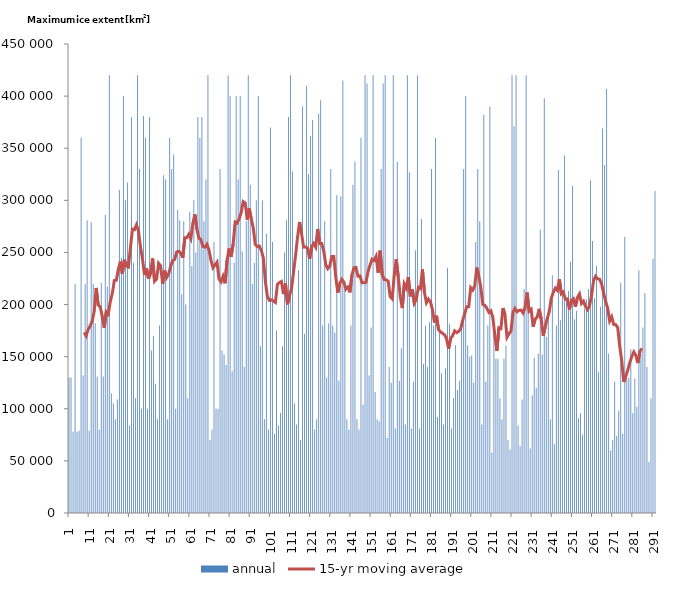
| Category | annual |
|---|---|
| 0 | 130000 |
| 1 | 130000 |
| 2 | 78000 |
| 3 | 220000 |
| 4 | 78000 |
| 5 | 79000 |
| 6 | 360000 |
| 7 | 132000 |
| 8 | 220000 |
| 9 | 281000 |
| 10 | 79000 |
| 11 | 279000 |
| 12 | 220000 |
| 13 | 182000 |
| 14 | 131000 |
| 15 | 80000 |
| 16 | 221000 |
| 17 | 131000 |
| 18 | 286000 |
| 19 | 217000 |
| 20 | 420000 |
| 21 | 115000 |
| 22 | 105000 |
| 23 | 90000 |
| 24 | 109000 |
| 25 | 310000 |
| 26 | 245000 |
| 27 | 400000 |
| 28 | 300000 |
| 29 | 317000 |
| 30 | 84000 |
| 31 | 380000 |
| 32 | 240000 |
| 33 | 110000 |
| 34 | 420000 |
| 35 | 330000 |
| 36 | 100000 |
| 37 | 381000 |
| 38 | 360000 |
| 39 | 100000 |
| 40 | 380000 |
| 41 | 156000 |
| 42 | 170000 |
| 43 | 124000 |
| 44 | 90000 |
| 45 | 180000 |
| 46 | 230000 |
| 47 | 324000 |
| 48 | 320000 |
| 49 | 90000 |
| 50 | 360000 |
| 51 | 330000 |
| 52 | 344000 |
| 53 | 100000 |
| 54 | 291000 |
| 55 | 281000 |
| 56 | 210000 |
| 57 | 280000 |
| 58 | 200000 |
| 59 | 110000 |
| 60 | 289000 |
| 61 | 237000 |
| 62 | 300000 |
| 63 | 250000 |
| 64 | 380000 |
| 65 | 360000 |
| 66 | 380000 |
| 67 | 280000 |
| 68 | 320000 |
| 69 | 420000 |
| 70 | 70000 |
| 71 | 80000 |
| 72 | 260000 |
| 73 | 100000 |
| 74 | 100000 |
| 75 | 330000 |
| 76 | 156000 |
| 77 | 152000 |
| 78 | 142000 |
| 79 | 420000 |
| 80 | 400000 |
| 81 | 136000 |
| 82 | 240000 |
| 83 | 400000 |
| 84 | 320000 |
| 85 | 400000 |
| 86 | 251000 |
| 87 | 140000 |
| 88 | 280000 |
| 89 | 420000 |
| 90 | 315000 |
| 91 | 220000 |
| 92 | 240000 |
| 93 | 300000 |
| 94 | 400000 |
| 95 | 160000 |
| 96 | 300000 |
| 97 | 90000 |
| 98 | 268000 |
| 99 | 80000 |
| 100 | 370000 |
| 101 | 260000 |
| 102 | 76000 |
| 103 | 175000 |
| 104 | 84000 |
| 105 | 96000 |
| 106 | 160000 |
| 107 | 250000 |
| 108 | 281000 |
| 109 | 380000 |
| 110 | 420000 |
| 111 | 328000 |
| 112 | 105000 |
| 113 | 85000 |
| 114 | 233000 |
| 115 | 70000 |
| 116 | 390000 |
| 117 | 172000 |
| 118 | 410000 |
| 119 | 325000 |
| 120 | 362000 |
| 121 | 377000 |
| 122 | 80000 |
| 123 | 90000 |
| 124 | 383000 |
| 125 | 396000 |
| 126 | 180000 |
| 127 | 280000 |
| 128 | 130000 |
| 129 | 182000 |
| 130 | 330000 |
| 131 | 180000 |
| 132 | 173000 |
| 133 | 305000 |
| 134 | 127000 |
| 135 | 304000 |
| 136 | 415000 |
| 137 | 215000 |
| 138 | 90000 |
| 139 | 80000 |
| 140 | 180000 |
| 141 | 315000 |
| 142 | 337000 |
| 143 | 90000 |
| 144 | 80000 |
| 145 | 360000 |
| 146 | 104000 |
| 147 | 420000 |
| 148 | 412000 |
| 149 | 132000 |
| 150 | 178000 |
| 151 | 420000 |
| 152 | 116000 |
| 153 | 90000 |
| 154 | 88000 |
| 155 | 330000 |
| 156 | 412000 |
| 157 | 420000 |
| 158 | 72000 |
| 159 | 140000 |
| 160 | 125000 |
| 161 | 420000 |
| 162 | 81000 |
| 163 | 337000 |
| 164 | 127000 |
| 165 | 158000 |
| 166 | 198000 |
| 167 | 85000 |
| 168 | 420000 |
| 169 | 327000 |
| 170 | 81000 |
| 171 | 126000 |
| 172 | 252000 |
| 173 | 420000 |
| 174 | 81000 |
| 175 | 282000 |
| 176 | 143000 |
| 177 | 180000 |
| 178 | 140000 |
| 179 | 183000 |
| 180 | 330000 |
| 181 | 180000 |
| 182 | 360000 |
| 183 | 92000 |
| 184 | 176000 |
| 185 | 134000 |
| 186 | 85000 |
| 187 | 139000 |
| 188 | 235000 |
| 189 | 181000 |
| 190 | 81000 |
| 191 | 110000 |
| 192 | 161000 |
| 193 | 118000 |
| 194 | 127000 |
| 195 | 183000 |
| 196 | 330000 |
| 197 | 400000 |
| 198 | 161000 |
| 199 | 150000 |
| 200 | 151000 |
| 201 | 125000 |
| 202 | 260000 |
| 203 | 330000 |
| 204 | 280000 |
| 205 | 85000 |
| 206 | 382000 |
| 207 | 126000 |
| 208 | 180000 |
| 209 | 390000 |
| 210 | 58000 |
| 211 | 175000 |
| 212 | 148000 |
| 213 | 148000 |
| 214 | 110000 |
| 215 | 90000 |
| 216 | 148000 |
| 217 | 161000 |
| 218 | 70000 |
| 219 | 61000 |
| 220 | 420000 |
| 221 | 371000 |
| 222 | 420000 |
| 223 | 84000 |
| 224 | 64000 |
| 225 | 109000 |
| 226 | 215000 |
| 227 | 420000 |
| 228 | 201000 |
| 229 | 62000 |
| 230 | 113000 |
| 231 | 149000 |
| 232 | 120000 |
| 233 | 153000 |
| 234 | 272000 |
| 235 | 152000 |
| 236 | 398000 |
| 237 | 169000 |
| 238 | 196000 |
| 239 | 90000 |
| 240 | 228000 |
| 241 | 66000 |
| 242 | 180000 |
| 243 | 329000 |
| 244 | 185000 |
| 245 | 211000 |
| 246 | 343000 |
| 247 | 204000 |
| 248 | 213000 |
| 249 | 241000 |
| 250 | 314000 |
| 251 | 186000 |
| 252 | 194000 |
| 253 | 91000 |
| 254 | 96000 |
| 255 | 75000 |
| 256 | 196000 |
| 257 | 205000 |
| 258 | 215000 |
| 259 | 319000 |
| 260 | 261000 |
| 261 | 206000 |
| 262 | 237000 |
| 263 | 135000 |
| 264 | 198000 |
| 265 | 369000 |
| 266 | 334000 |
| 267 | 407000 |
| 268 | 153000 |
| 269 | 60000 |
| 270 | 70000 |
| 271 | 126000 |
| 272 | 74000 |
| 273 | 98000 |
| 274 | 221000 |
| 275 | 76000 |
| 276 | 265000 |
| 277 | 129000 |
| 278 | 130000 |
| 279 | 157000 |
| 280 | 96000 |
| 281 | 129000 |
| 282 | 102000 |
| 283 | 233000 |
| 284 | 153000 |
| 285 | 178000 |
| 286 | 211000 |
| 287 | 140000 |
| 288 | 49000 |
| 289 | 110000 |
| 290 | 244000 |
| 291 | 309000 |